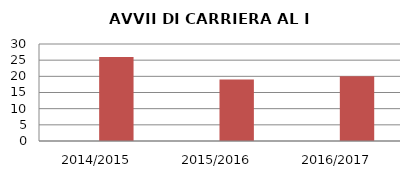
| Category | ANNO | NUMERO |
|---|---|---|
| 2014/2015 | 0 | 26 |
| 2015/2016 | 0 | 19 |
| 2016/2017 | 0 | 20 |